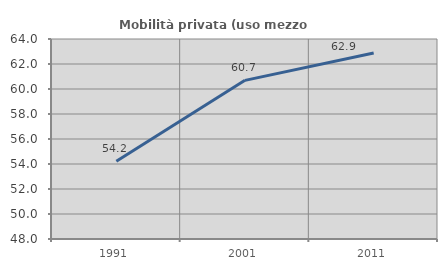
| Category | Mobilità privata (uso mezzo privato) |
|---|---|
| 1991.0 | 54.222 |
| 2001.0 | 60.692 |
| 2011.0 | 62.877 |